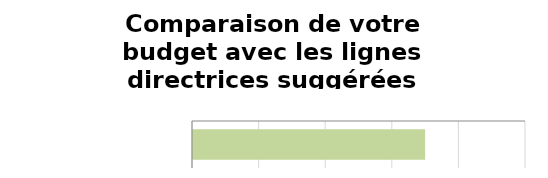
| Category | Series 0 | Series 1 |
|---|---|---|
| Votre budget s'affiche ici | 0 | 0.35 |